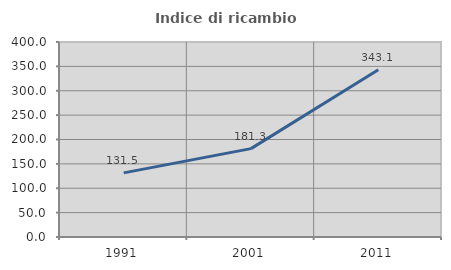
| Category | Indice di ricambio occupazionale  |
|---|---|
| 1991.0 | 131.549 |
| 2001.0 | 181.33 |
| 2011.0 | 343.051 |